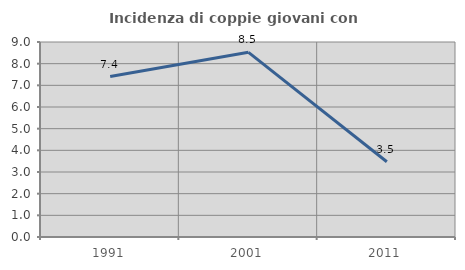
| Category | Incidenza di coppie giovani con figli |
|---|---|
| 1991.0 | 7.407 |
| 2001.0 | 8.523 |
| 2011.0 | 3.472 |